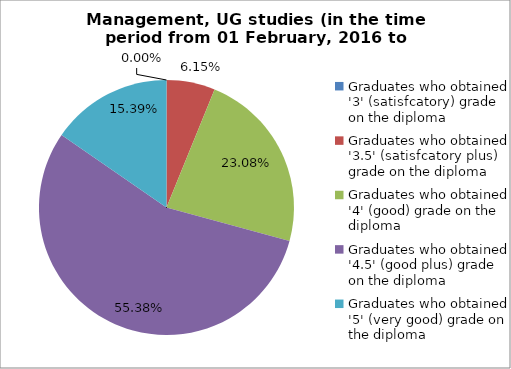
| Category | Series 0 |
|---|---|
| Graduates who obtained '3' (satisfcatory) grade on the diploma | 0 |
| Graduates who obtained '3.5' (satisfcatory plus) grade on the diploma | 6.154 |
| Graduates who obtained '4' (good) grade on the diploma | 23.077 |
| Graduates who obtained '4.5' (good plus) grade on the diploma | 55.385 |
| Graduates who obtained '5' (very good) grade on the diploma | 15.385 |